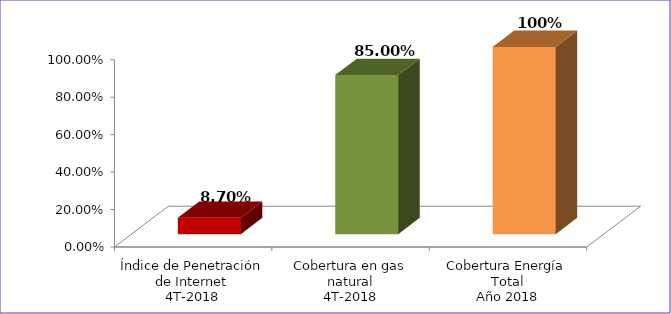
| Category | Series 0 |
|---|---|
| Índice de Penetración de Internet
4T-2018 | 0.087 |
| Cobertura en gas natural
4T-2018 | 0.85 |
| Cobertura Energía Total
Año 2018 | 1 |